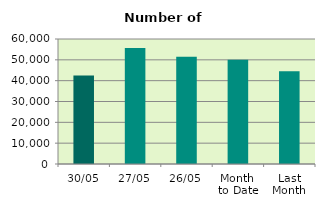
| Category | Series 0 |
|---|---|
| 30/05 | 42522 |
| 27/05 | 55654 |
| 26/05 | 51436 |
| Month 
to Date | 50025.238 |
| Last
Month | 44538 |